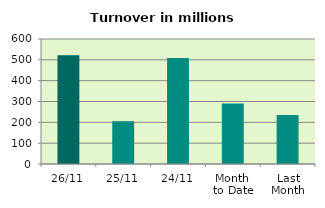
| Category | Series 0 |
|---|---|
| 26/11 | 522.053 |
| 25/11 | 205.422 |
| 24/11 | 509.269 |
| Month 
to Date | 290.707 |
| Last
Month | 235.36 |